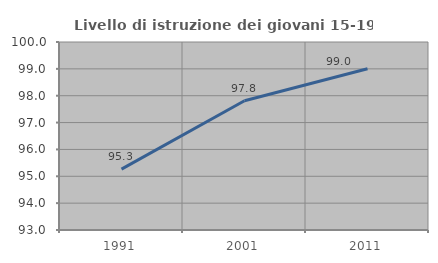
| Category | Livello di istruzione dei giovani 15-19 anni |
|---|---|
| 1991.0 | 95.266 |
| 2001.0 | 97.814 |
| 2011.0 | 99.006 |